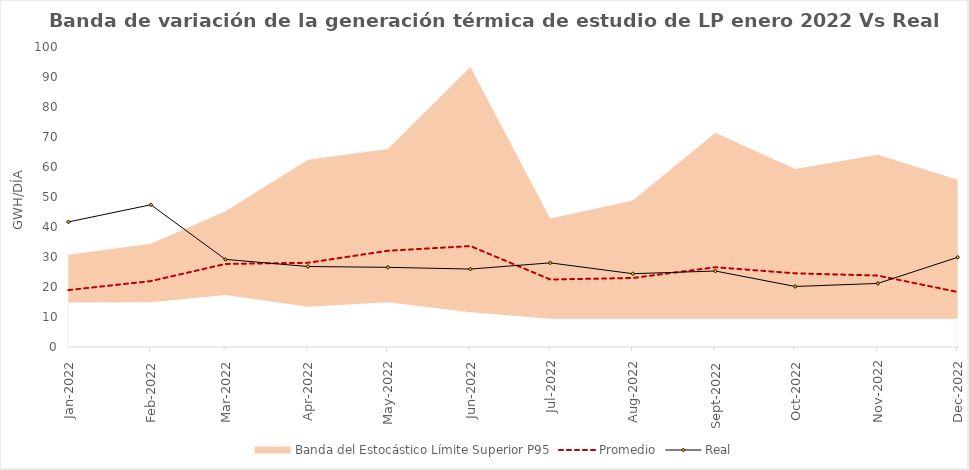
| Category | Promedio | Real |
|---|---|---|
| 2022-01-01 | 18.968 | 41.685 |
| 2022-02-01 | 21.968 | 47.407 |
| 2022-03-01 | 27.691 | 29.2 |
| 2022-04-01 | 28.072 | 26.823 |
| 2022-05-01 | 32.079 | 26.561 |
| 2022-06-01 | 33.647 | 25.98 |
| 2022-07-01 | 22.498 | 28.043 |
| 2022-08-01 | 22.999 | 24.432 |
| 2022-09-01 | 26.586 | 25.333 |
| 2022-10-01 | 24.555 | 20.176 |
| 2022-11-01 | 23.812 | 21.188 |
| 2022-12-01 | 18.35 | 29.898 |